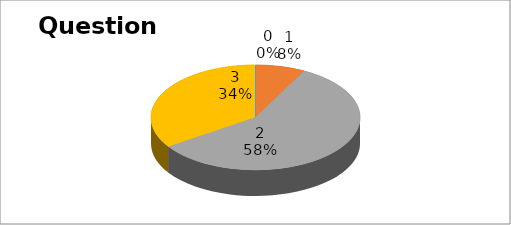
| Category | Series 0 |
|---|---|
| 0 | 0 |
| 1 | 10 |
| 2 | 76 |
| 3 | 45 |